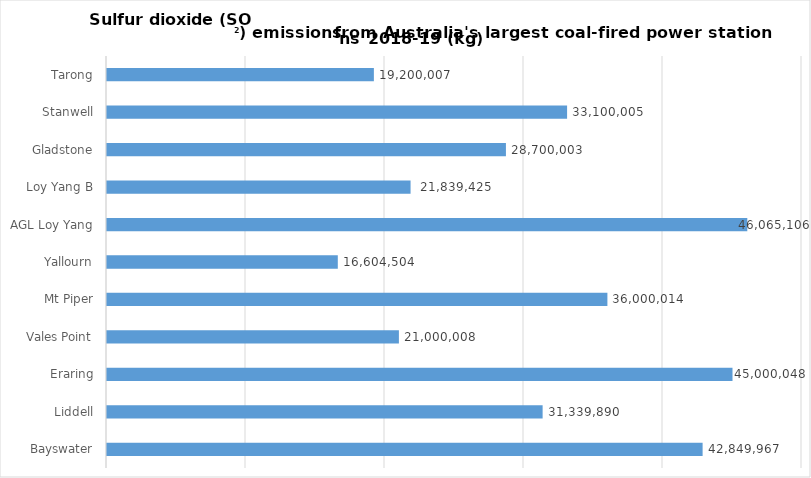
| Category | Series 0 |
|---|---|
| Bayswater | 42849966.683 |
| Liddell | 31339889.62 |
| Eraring | 45000048 |
| Vales Point | 21000008.1 |
| Mt Piper | 36000014 |
| Yallourn | 16604504 |
| AGL Loy Yang | 46065105.631 |
| Loy Yang B | 21839425.2 |
| Gladstone | 28700003.39 |
| Stanwell | 33100005.26 |
| Tarong | 19200007.44 |